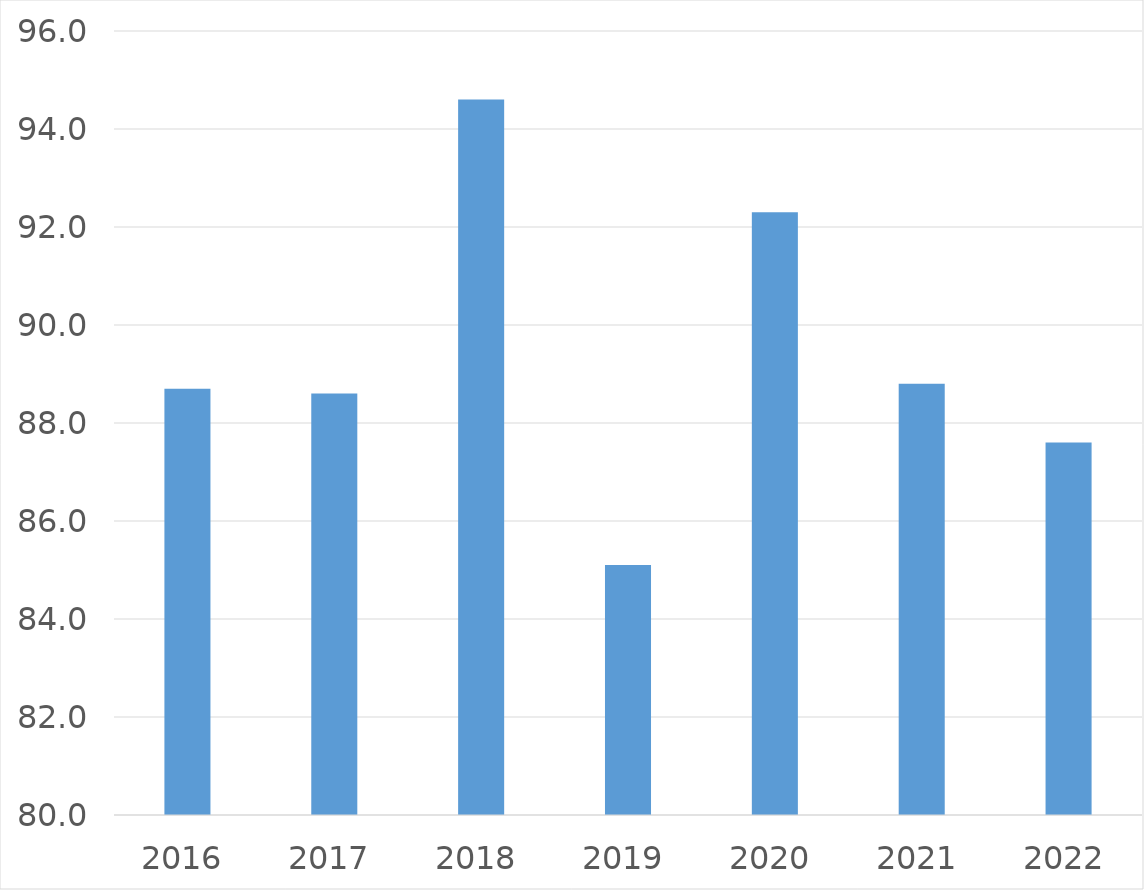
| Category | Series 0 |
|---|---|
| 2016 | 88.7 |
| 2017 | 88.6 |
| 2018 | 94.6 |
| 2019 | 85.1 |
| 2020 | 92.3 |
| 2021 | 88.8 |
| 2022 | 87.6 |